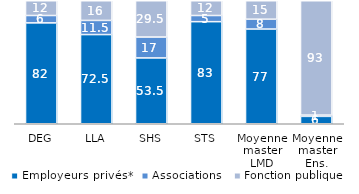
| Category | Employeurs privés* | Associations | Fonction publique |
|---|---|---|---|
| DEG | 82 | 6 | 12 |
| LLA | 72.5 | 11.5 | 16 |
| SHS | 53.5 | 17 | 29.5 |
| STS | 83 | 5 | 12 |
| Moyenne master LMD | 77 | 8 | 15 |
| Moyenne master Ens. | 6 | 1 | 93 |